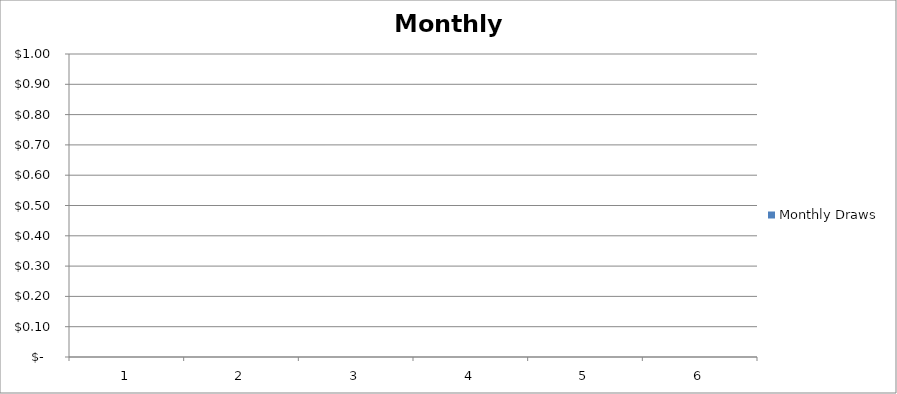
| Category | Monthly Draws |
|---|---|
| 0 | 0 |
| 1 | 0 |
| 2 | 0 |
| 3 | 0 |
| 4 | 0 |
| 5 | 0 |